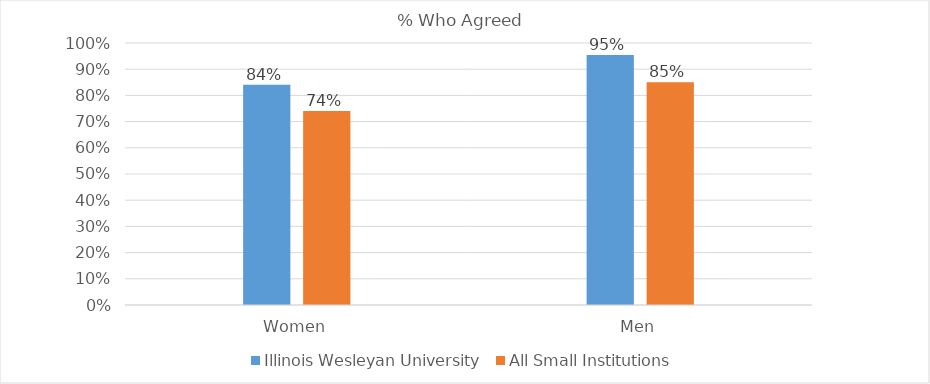
| Category | Illinois Wesleyan University | All Small Institutions |
|---|---|---|
| Women | 0.841 | 0.74 |
| Men | 0.955 | 0.85 |